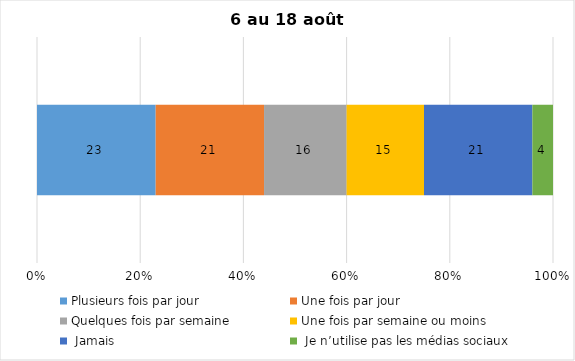
| Category | Plusieurs fois par jour | Une fois par jour | Quelques fois par semaine   | Une fois par semaine ou moins   |  Jamais   |  Je n’utilise pas les médias sociaux |
|---|---|---|---|---|---|---|
| 0 | 23 | 21 | 16 | 15 | 21 | 4 |